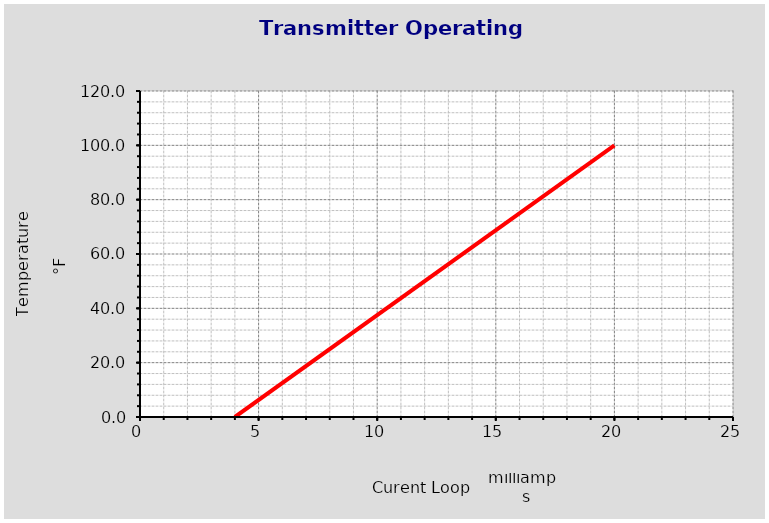
| Category | Transmitter Operating Curve |
|---|---|
| 4.0 | 0 |
| 20.0 | 100 |